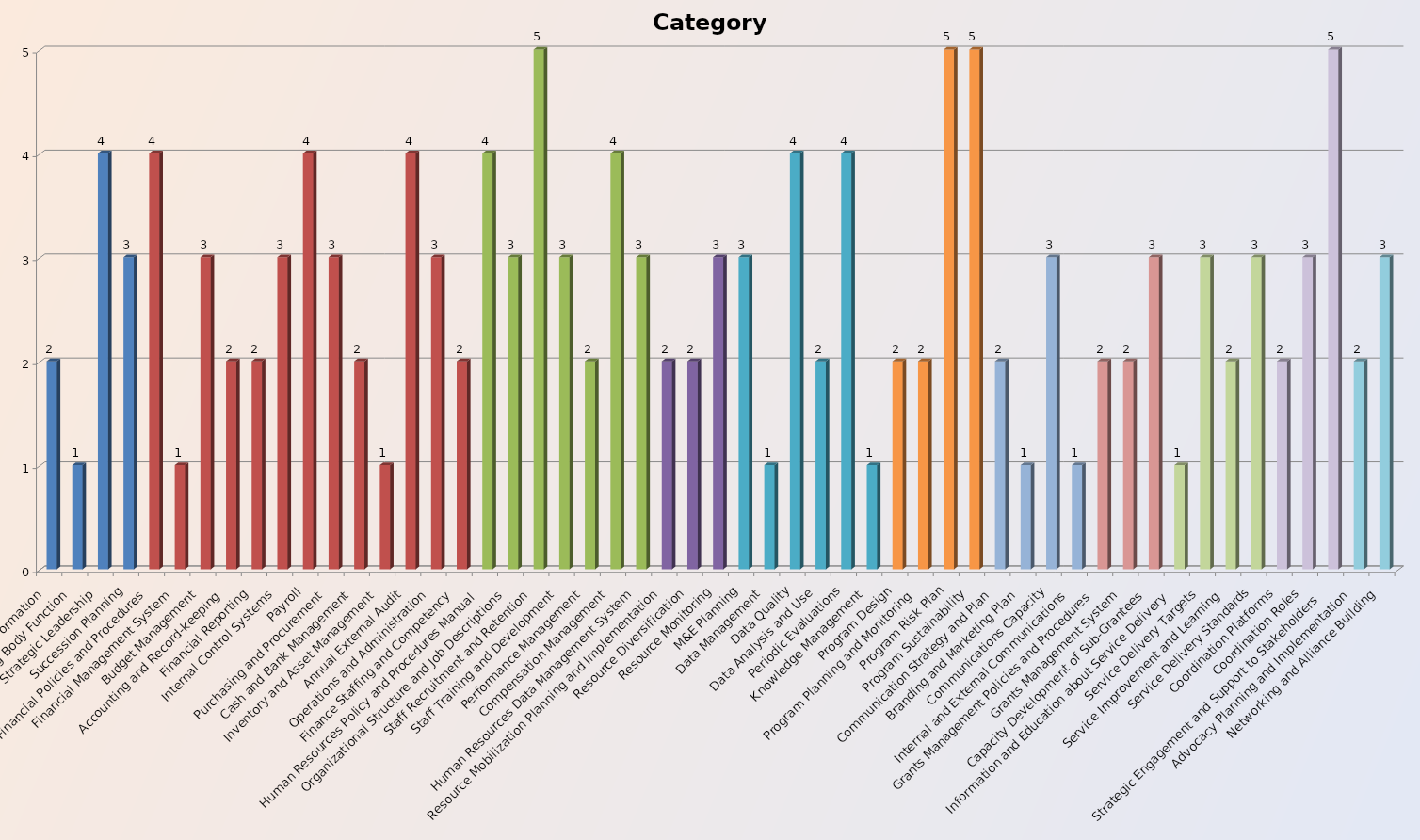
| Category | Category Score |
|---|---|
| Governing Body Formation | 2 |
| Governing Body Function | 1 |
| Strategic Leadership | 4 |
| Succession Planning | 3 |
| Financial Policies and Procedures | 4 |
| Financial Management System | 1 |
| Budget Management | 3 |
| Accounting and Record-keeping | 2 |
| Financial Reporting | 2 |
| Internal Control Systems | 3 |
| Payroll | 4 |
| Purchasing and Procurement | 3 |
| Cash and Bank Management | 2 |
| Inventory and Asset Management | 1 |
| Annual External Audit | 4 |
| Operations and Administration | 3 |
| Finance Staffing and Competency | 2 |
| Human Resources Policy and Procedures Manual | 4 |
| Organizational Structure and Job Descriptions | 3 |
| Staff Recruitment and Retention | 5 |
| Staff Training and Development | 3 |
| Performance Management | 2 |
| Compensation Management | 4 |
| Human Resources Data Management System | 3 |
| Resource Mobilization Planning and Implementation | 2 |
| Resource Diversification | 2 |
| Resource Monitoring | 3 |
| M&E Planning | 3 |
| Data Management | 1 |
| Data Quality | 4 |
| Data Analysis and Use | 2 |
| Periodic Evaluations | 4 |
| Knowledge Management | 1 |
| Program Design | 2 |
| Program Planning and Monitoring | 2 |
| Program Risk Plan | 5 |
| Program Sustainability | 5 |
| Communication Strategy and Plan | 2 |
| Branding and Marketing Plan | 1 |
| Communications Capacity | 3 |
| Internal and External Communications | 1 |
| Grants Management Policies and Procedures | 2 |
| Grants Management System | 2 |
| Capacity Development of Sub-Grantees | 3 |
| Information and Education about Service Delivery | 1 |
| Service Delivery Targets | 3 |
| Service Improvement and Learning | 2 |
| Service Delivery Standards | 3 |
| Coordination Platforms | 2 |
| Coordination Roles | 3 |
| Strategic Engagement and Support to Stakeholders | 5 |
| Advocacy Planning and Implementation | 2 |
| Networking and Alliance Building | 3 |